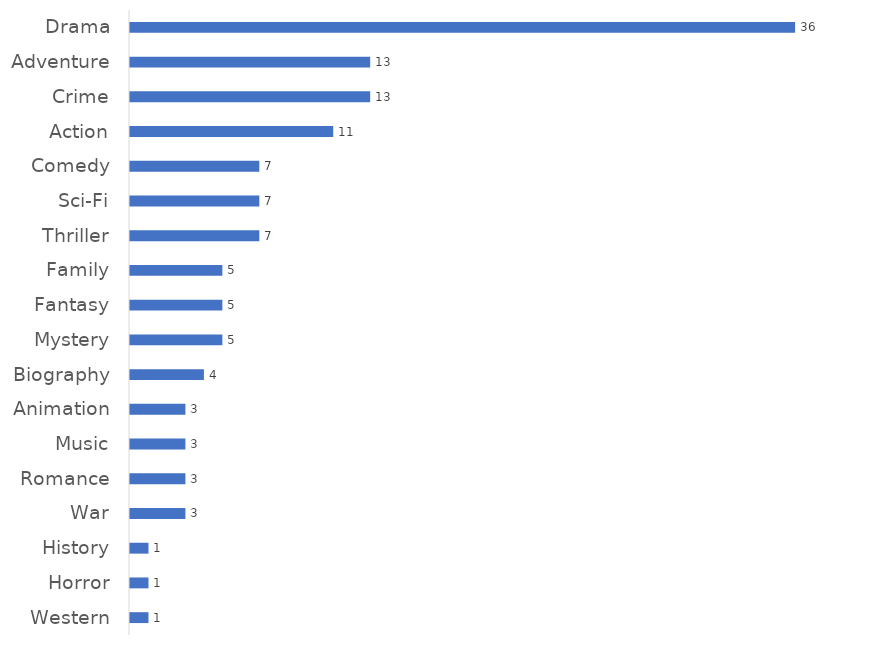
| Category | Series 0 |
|---|---|
| Drama | 36 |
| Adventure | 13 |
| Crime | 13 |
| Action | 11 |
| Comedy | 7 |
| Sci-Fi | 7 |
| Thriller | 7 |
| Family | 5 |
| Fantasy | 5 |
| Mystery | 5 |
| Biography | 4 |
| Animation | 3 |
| Music | 3 |
| Romance | 3 |
| War | 3 |
| History | 1 |
| Horror | 1 |
| Western | 1 |